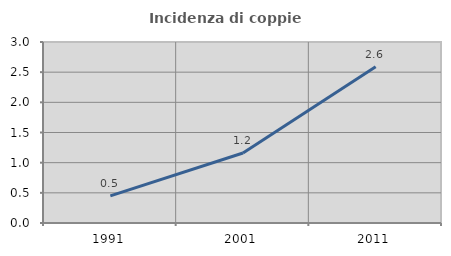
| Category | Incidenza di coppie miste |
|---|---|
| 1991.0 | 0.451 |
| 2001.0 | 1.159 |
| 2011.0 | 2.589 |